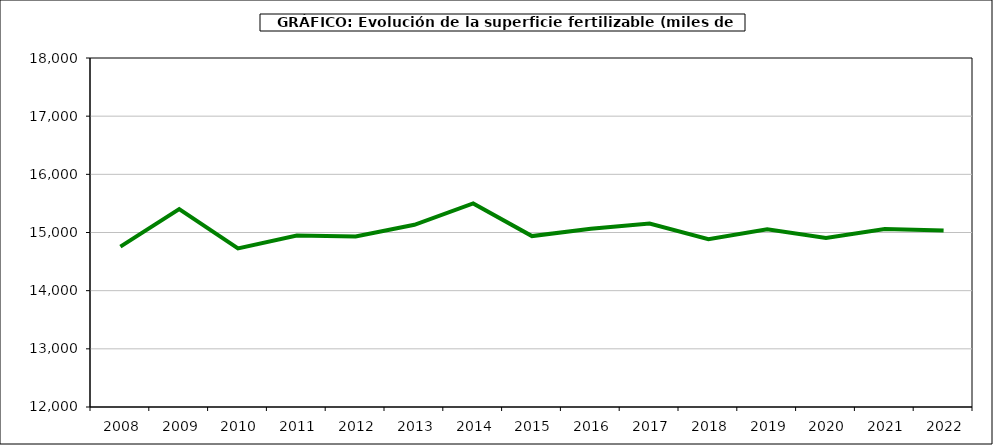
| Category | fertilizantes |
|---|---|
|   2008 | 14757 |
|   2009 | 15402 |
|   2010 | 14727 |
|   2011 | 14947 |
|   2012 | 14932 |
|   2013 | 15133 |
|   2014 | 15499 |
|   2015 | 14938 |
|   2016 | 15065 |
|   2017 | 15153 |
|   2018 | 14883 |
|   2019 | 15055 |
|   2020 | 14906 |
|   2021 | 15060.96 |
|   2022 | 15034.391 |